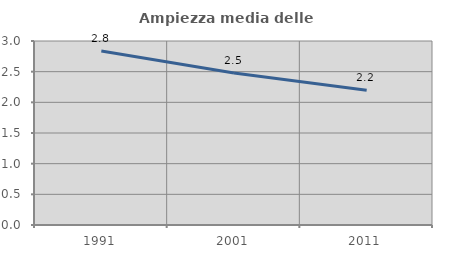
| Category | Ampiezza media delle famiglie |
|---|---|
| 1991.0 | 2.836 |
| 2001.0 | 2.479 |
| 2011.0 | 2.199 |